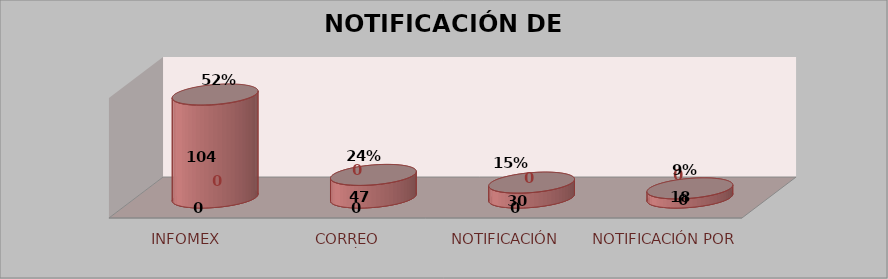
| Category | Series 0 | Series 1 | Series 2 | Series 3 |
|---|---|---|---|---|
| INFOMEX |  |  | 214 | 0.688 |
| CORREO ELECTRÓNICO |  |  | 47 | 0.151 |
| NOTIFICACIÓN PERSONAL |  |  | 31 | 0.1 |
| NOTIFICACIÓN POR LISTAS |  |  | 19 | 0.061 |